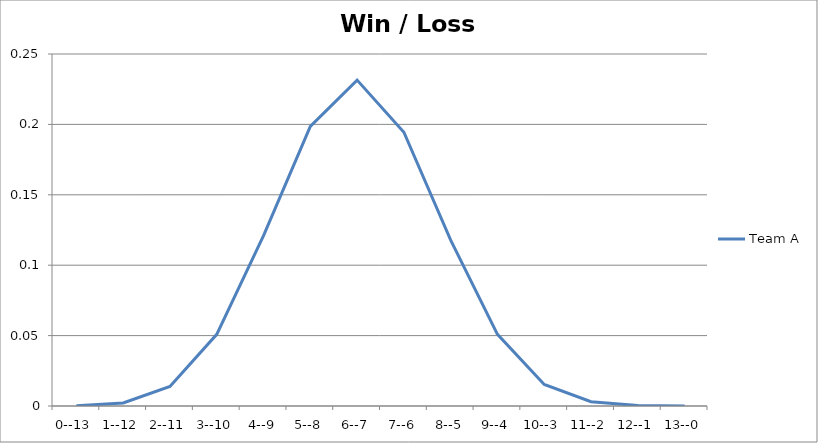
| Category | Team A |
|---|---|
| 0--13 | 0 |
| 1--12 | 0.002 |
| 2--11 | 0.014 |
| 3--10 | 0.051 |
| 4--9 | 0.121 |
| 5--8 | 0.199 |
| 6--7 | 0.231 |
| 7--6 | 0.194 |
| 8--5 | 0.118 |
| 9--4 | 0.051 |
| 10--3 | 0.015 |
| 11--2 | 0.003 |
| 12--1 | 0 |
| 13--0 | 0 |